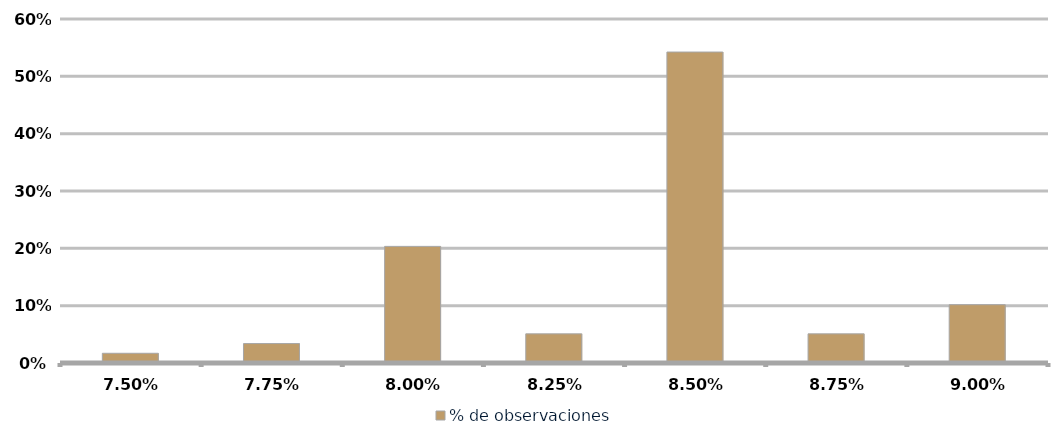
| Category | % de observaciones  |
|---|---|
| 0.075 | 0.017 |
| 0.0775 | 0.034 |
| 0.08 | 0.203 |
| 0.0825 | 0.051 |
| 0.085 | 0.542 |
| 0.08750000000000001 | 0.051 |
| 0.09000000000000001 | 0.102 |